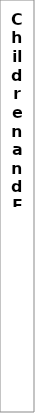
| Category | 2013 | 2014 |
|---|---|---|
| All ELCC | 0.58 | 0.76 |
| LA ELCC | 0.9 | 0.96 |
| Private partnership ELCC | 0.67 | 0.65 |
| Voluntary partnership ELCC | 0.29 | 0.36 |